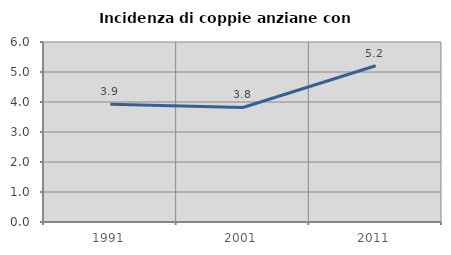
| Category | Incidenza di coppie anziane con figli |
|---|---|
| 1991.0 | 3.922 |
| 2001.0 | 3.817 |
| 2011.0 | 5.208 |